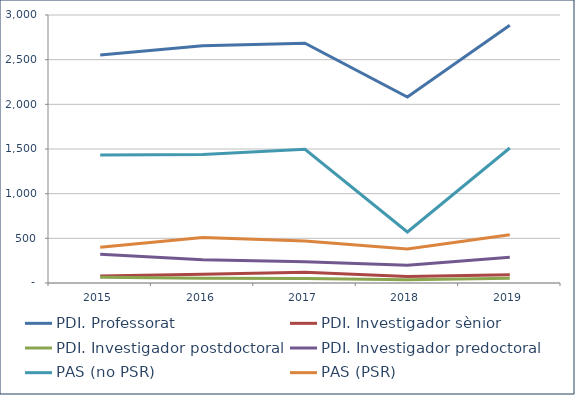
| Category | PDI. Professorat | PDI. Investigador sènior | PDI. Investigador postdoctoral | PDI. Investigador predoctoral | PAS (no PSR) | PAS (PSR) |
|---|---|---|---|---|---|---|
| 2015.0 | 2552 | 79 | 63 | 321 | 1432 | 400 |
| 2016.0 | 2656 | 99 | 52 | 259 | 1438 | 508 |
| 2017.0 | 2684 | 121 | 50 | 238 | 1497 | 470 |
| 2018.0 | 2081 | 72 | 37 | 198 | 571 | 380 |
| 2019.0 | 2885 | 92 | 52 | 288 | 1511 | 541 |